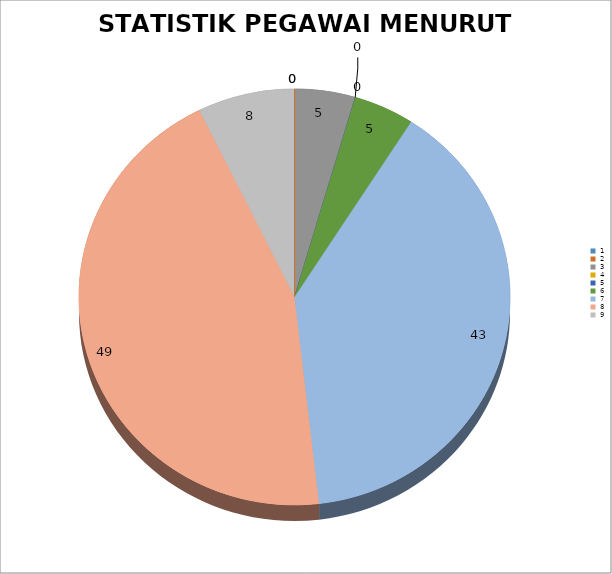
| Category | JUMLAH |
|---|---|
| 0 | 0 |
| 1 | 0 |
| 2 | 5 |
| 3 | 0 |
| 4 | 0 |
| 5 | 5 |
| 6 | 43 |
| 7 | 49 |
| 8 | 8 |